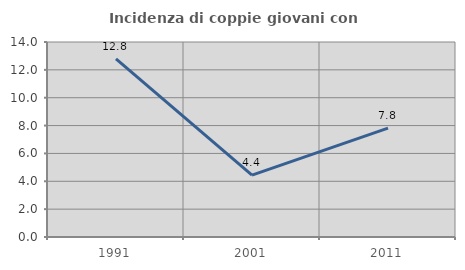
| Category | Incidenza di coppie giovani con figli |
|---|---|
| 1991.0 | 12.782 |
| 2001.0 | 4.444 |
| 2011.0 | 7.812 |